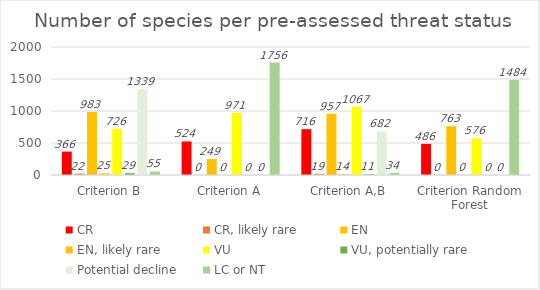
| Category | CR | CR, likely rare | EN | EN, likely rare | VU | VU, potentially rare | Potential decline | LC or NT |
|---|---|---|---|---|---|---|---|---|
| Criterion B | 366 | 22 | 983 | 25 | 726 | 29 | 1339 | 55 |
| Criterion A | 524 | 0 | 249 | 0 | 971 | 0 | 0 | 1756 |
| Criterion A,B | 716 | 19 | 957 | 14 | 1067 | 11 | 682 | 34 |
| Criterion Random Forest | 486 | 0 | 763 | 0 | 576 | 0 | 0 | 1484 |